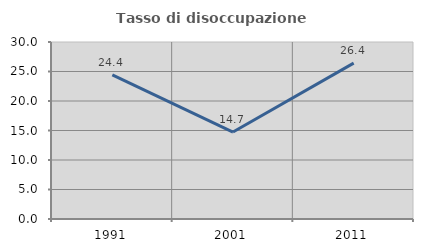
| Category | Tasso di disoccupazione giovanile  |
|---|---|
| 1991.0 | 24.427 |
| 2001.0 | 14.737 |
| 2011.0 | 26.427 |